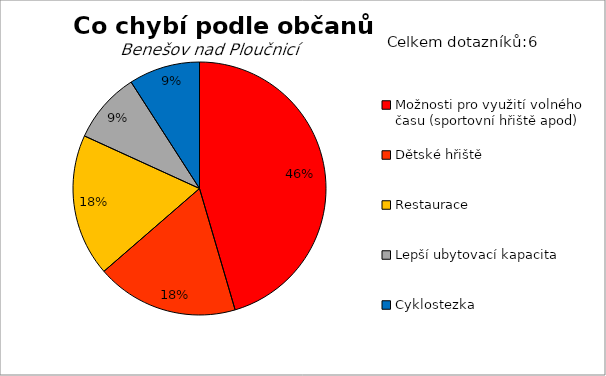
| Category | Series 0 |
|---|---|
| Možnosti pro využití volného času (sportovní hřiště apod) | 5 |
| Dětské hřiště | 2 |
| Restaurace | 2 |
| Lepší ubytovací kapacita | 1 |
| Cyklostezka | 1 |